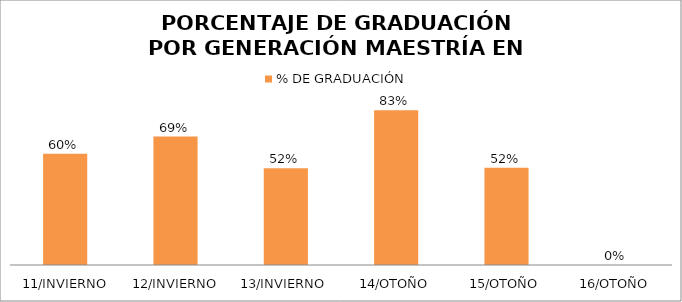
| Category | % DE GRADUACIÓN  |
|---|---|
|  11/INVIERNO | 0.6 |
|  12/INVIERNO | 0.692 |
| 13/INVIERNO | 0.522 |
| 14/OTOÑO | 0.833 |
| 15/OTOÑO | 0.524 |
| 16/OTOÑO | 0 |